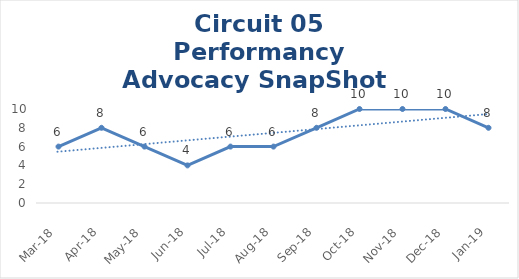
| Category | Circuit 05 |
|---|---|
| Mar-18 | 6 |
| Apr-18 | 8 |
| May-18 | 6 |
| Jun-18 | 4 |
| Jul-18 | 6 |
| Aug-18 | 6 |
| Sep-18 | 8 |
| Oct-18 | 10 |
| Nov-18 | 10 |
| Dec-18 | 10 |
| Jan-19 | 8 |